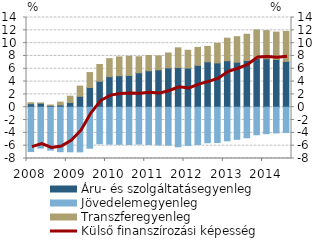
| Category | Áru- és szolgáltatásegyenleg | Jövedelemegyenleg | Transzferegyenleg |
|---|---|---|---|
| 2008.0 | 0.547 | -6.918 | 0.145 |
| 2008.0 | 0.613 | -6.375 | 0.016 |
| 2008.0 | 0.278 | -6.687 | 0.057 |
| 2008.0 | 0.359 | -6.936 | 0.438 |
| 2009.0 | 0.731 | -6.96 | 0.991 |
| 2009.0 | 1.705 | -6.966 | 1.597 |
| 2009.0 | 3.081 | -6.394 | 2.328 |
| 2009.0 | 4.056 | -5.703 | 2.608 |
| 2010.0 | 4.769 | -5.764 | 2.812 |
| 2010.0 | 4.923 | -5.79 | 2.925 |
| 2010.0 | 4.955 | -5.811 | 3.006 |
| 2010.0 | 5.378 | -5.755 | 2.494 |
| 2011.0 | 5.69 | -5.809 | 2.377 |
| 2011.0 | 5.84 | -5.881 | 2.167 |
| 2011.0 | 6.134 | -5.931 | 2.331 |
| 2011.0 | 6.192 | -6.168 | 3.073 |
| 2012.0 | 6.104 | -5.951 | 2.783 |
| 2012.0 | 6.536 | -5.81 | 2.793 |
| 2012.0 | 7.084 | -5.536 | 2.41 |
| 2012.0 | 6.916 | -5.512 | 3.053 |
| 2013.0 | 7.264 | -5.245 | 3.511 |
| 2013.0 | 7.027 | -5.001 | 3.983 |
| 2013.0 | 7.286 | -4.767 | 4.101 |
| 2013.0 | 7.587 | -4.297 | 4.475 |
| 2014.0 | 7.56 | -4.13 | 4.393 |
| 2014.0 | 7.45 | -4.014 | 4.272 |
| 2014.0 | 7.153 | -3.948 | 4.677 |